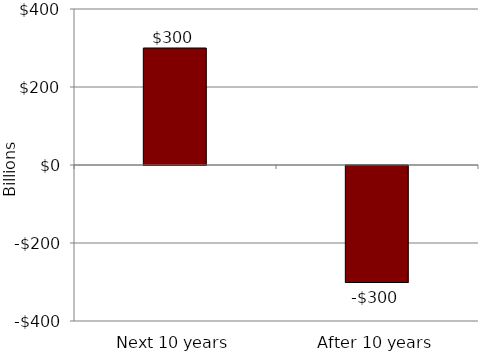
| Category | Series 0 |
|---|---|
| Next 10 years | 300 |
| After 10 years | -300 |